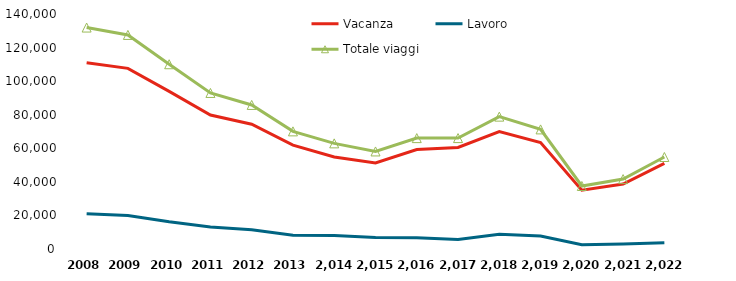
| Category | Vacanza | Lavoro | Totale viaggi |
|---|---|---|---|
| 2008 | 110901 | 21026 | 131928 |
| 2009 | 107603 | 19931 | 127533 |
| 2010 | 93894 | 16179 | 110073 |
| 2011 | 79811 | 13160 | 92971 |
| 2012 | 74301 | 11524 | 85825 |
| 2013 | 61916 | 8167 | 70083 |
| 2014 | 54816 | 8112 | 62927 |
| 2015 | 51222 | 6894 | 58115 |
| 2016 | 59298 | 6757 | 66055 |
| 2017 | 60455 | 5626 | 66081 |
| 2018 | 70004 | 8848 | 78853 |
| 2019 | 63467 | 7788 | 71254 |
| 2020 | 35024 | 2503 | 37527 |
| 2021 | 38685 | 2957 | 41642 |
| 2022 | 51040 | 3771 | 54811 |